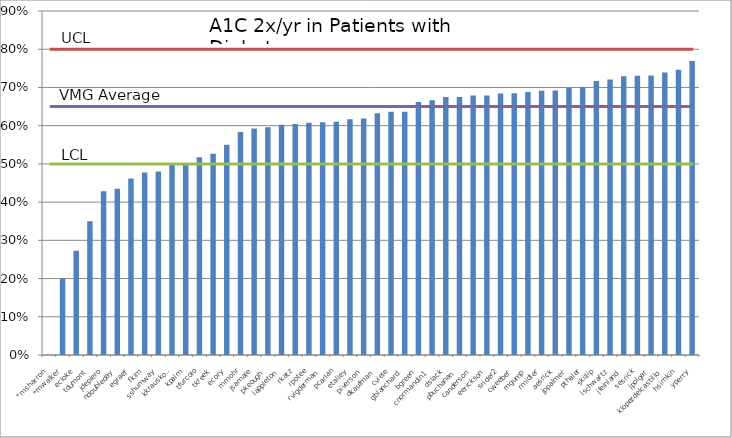
| Category | Series 0 |
|---|---|
| *msharron | 0 |
| *mwalker | 0.2 |
| ecloke | 0.273 |
| tdumont | 0.35 |
| jdepiero | 0.429 |
| ndoubleday | 0.435 |
| egraef | 0.462 |
| fkim | 0.478 |
| sshumway | 0.48 |
| kkrauskopf | 0.5 |
| kpalm | 0.5 |
| tfurcolo | 0.517 |
| tkreek | 0.526 |
| ecory | 0.55 |
| mmohr | 0.583 |
| jsamale | 0.593 |
| pkeough | 0.596 |
| lappleton | 0.603 |
| rkatz | 0.604 |
| rpotee | 0.608 |
| rvigderman | 0.609 |
| pcarlan | 0.61 |
| etalley | 0.617 |
| piverson | 0.619 |
| dkaufman | 0.632 |
| cviele | 0.636 |
| gblanchard | 0.636 |
| bgreen | 0.662 |
| cnormandin1 | 0.667 |
| dslack | 0.675 |
| pbuchanan | 0.675 |
| canderson | 0.679 |
| eerickson | 0.679 |
| srider2 | 0.684 |
| cweeber | 0.685 |
| mgump | 0.688 |
| rmidler | 0.691 |
| aesrick | 0.692 |
| jppalmer | 0.699 |
| pthaler | 0.701 |
| skillip | 0.717 |
| lschwartz | 0.721 |
| jfeinland | 0.729 |
| sesrick | 0.731 |
| jpolgar | 0.731 |
| klopezdelcastillo | 0.739 |
| hsimkin | 0.746 |
| yperry | 0.769 |